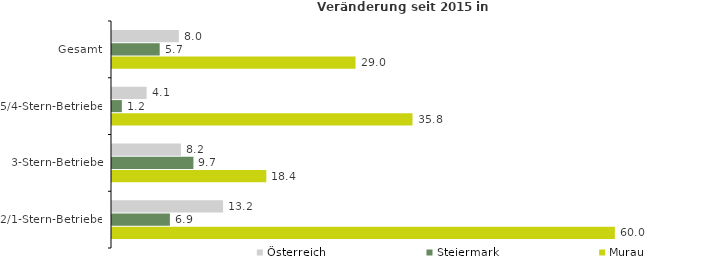
| Category | Österreich | Steiermark | Murau |
|---|---|---|---|
| Gesamt | 7.97 | 5.689 | 29.041 |
| 5/4-Stern-Betriebe | 4.13 | 1.174 | 35.837 |
| 3-Stern-Betriebe | 8.22 | 9.709 | 18.399 |
| 2/1-Stern-Betriebe | 13.246 | 6.904 | 59.967 |